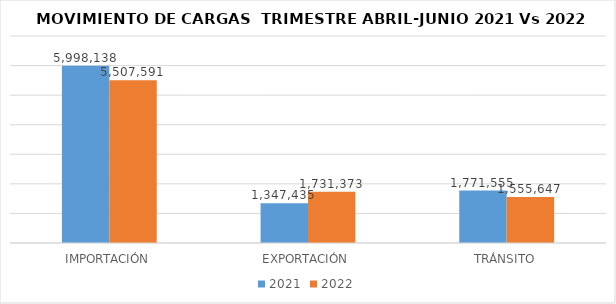
| Category | 2021 | 2022 |
|---|---|---|
| IMPORTACIÓN | 5998138 | 5507590.89 |
| EXPORTACIÓN | 1347435 | 1731372.54 |
| TRÁNSITO | 1771555 | 1555647 |